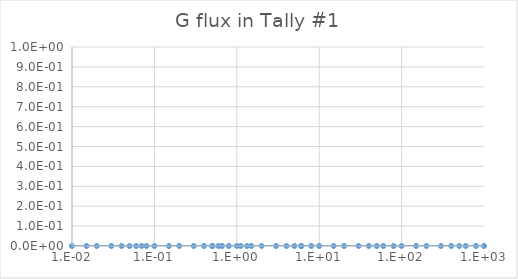
| Category | Series 0 |
|---|---|
| 0.01 | 0 |
| 0.015 | 0 |
| 0.02 | 0 |
| 0.03 | 0 |
| 0.04 | 0 |
| 0.05 | 0 |
| 0.06 | 0 |
| 0.07 | 0 |
| 0.08 | 0 |
| 0.1 | 0 |
| 0.15 | 0 |
| 0.2 | 0 |
| 0.3 | 0 |
| 0.4 | 0 |
| 0.5 | 0 |
| 0.511 | 0 |
| 0.6 | 0 |
| 0.662 | 0 |
| 0.8 | 0 |
| 1.0 | 0 |
| 1.117 | 0 |
| 1.33 | 0 |
| 1.5 | 0 |
| 2.0 | 0 |
| 3.0 | 0 |
| 4.0 | 0 |
| 5.0 | 0 |
| 6.0 | 0 |
| 6.129 | 0 |
| 8.0 | 0 |
| 10.0 | 0 |
| 15.0 | 0 |
| 20.0 | 0 |
| 30.0 | 0 |
| 40.0 | 0 |
| 50.0 | 0 |
| 60.0 | 0 |
| 80.0 | 0 |
| 100.0 | 0 |
| 150.0 | 0 |
| 200.0 | 0 |
| 300.0 | 0 |
| 400.0 | 0 |
| 500.0 | 0 |
| 600.0 | 0 |
| 800.0 | 0 |
| 1000.0 | 0 |
| 1500.0 | 0 |
| 2000.0 | 0 |
| 3000.0 | 0 |
| 4000.0 | 0 |
| 5000.0 | 0 |
| 6000.0 | 0 |
| 8000.0 | 0 |
| 10000.0 | 0 |